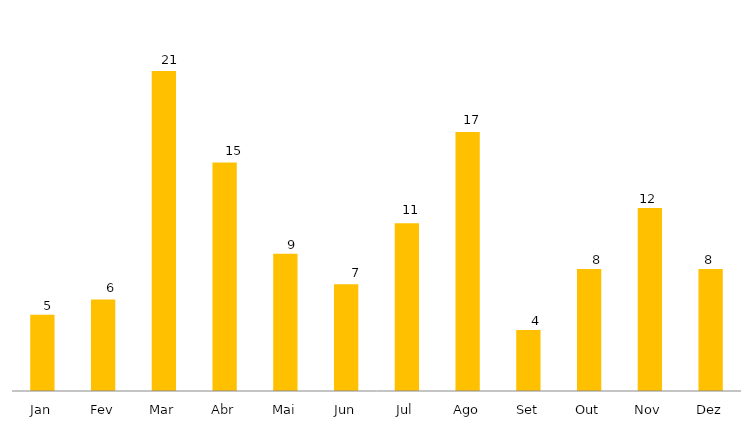
| Category | Projetos Iniciados em 2020 |
|---|---|
| Jan | 5 |
| Fev | 6 |
| Mar | 21 |
| Abr | 15 |
| Mai | 9 |
| Jun | 7 |
| Jul | 11 |
| Ago | 17 |
| Set | 4 |
| Out | 8 |
| Nov | 12 |
| Dez | 8 |